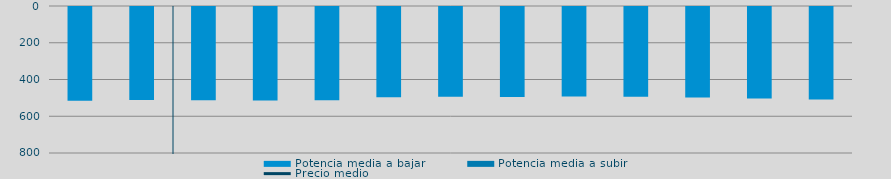
| Category | Potencia media a bajar | Potencia media a subir |
|---|---|---|
| 0 | 510.776 |  |
| 1 | 505.54 |  |
| 2 | 508.149 |  |
| 3 | 509.307 |  |
| 4 | 507.622 |  |
| 5 | 491.087 |  |
| 6 | 488.923 |  |
| 7 | 489.119 |  |
| 8 | 487.546 |  |
| 9 | 488.653 |  |
| 10 | 492.01 |  |
| 11 | 498.529 |  |
| 12 | 503.264 |  |